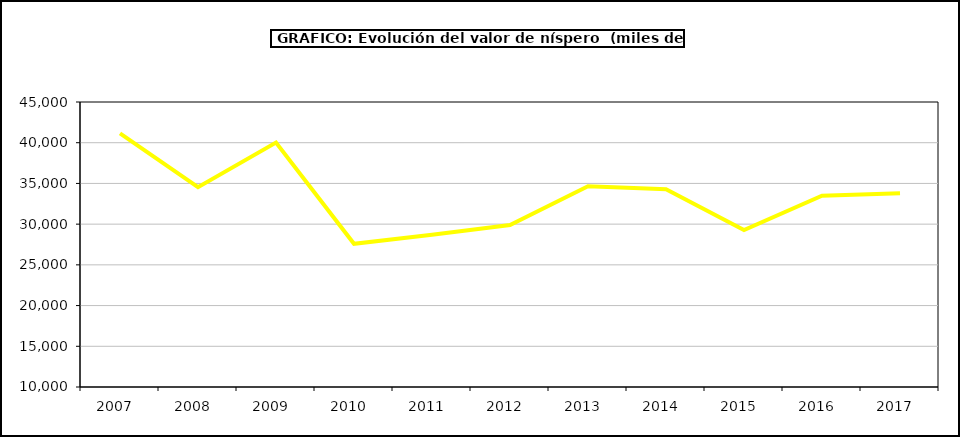
| Category | valor níspero |
|---|---|
| 2007.0 | 41152.394 |
| 2008.0 | 34546.071 |
| 2009.0 | 40013.597 |
| 2010.0 | 27580.978 |
| 2011.0 | 28708.277 |
| 2012.0 | 29897.05 |
| 2013.0 | 34664.445 |
| 2014.0 | 34281.045 |
| 2015.0 | 29278 |
| 2016.0 | 33490 |
| 2017.0 | 33807.127 |